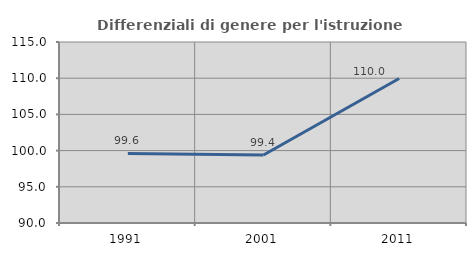
| Category | Differenziali di genere per l'istruzione superiore |
|---|---|
| 1991.0 | 99.611 |
| 2001.0 | 99.388 |
| 2011.0 | 109.966 |